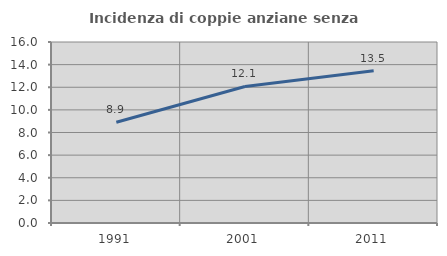
| Category | Incidenza di coppie anziane senza figli  |
|---|---|
| 1991.0 | 8.91 |
| 2001.0 | 12.072 |
| 2011.0 | 13.462 |